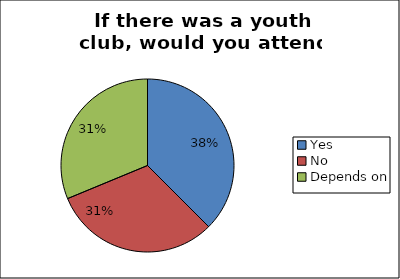
| Category | Series 0 |
|---|---|
| Yes | 0.375 |
| No | 0.312 |
| Depends on | 0.312 |